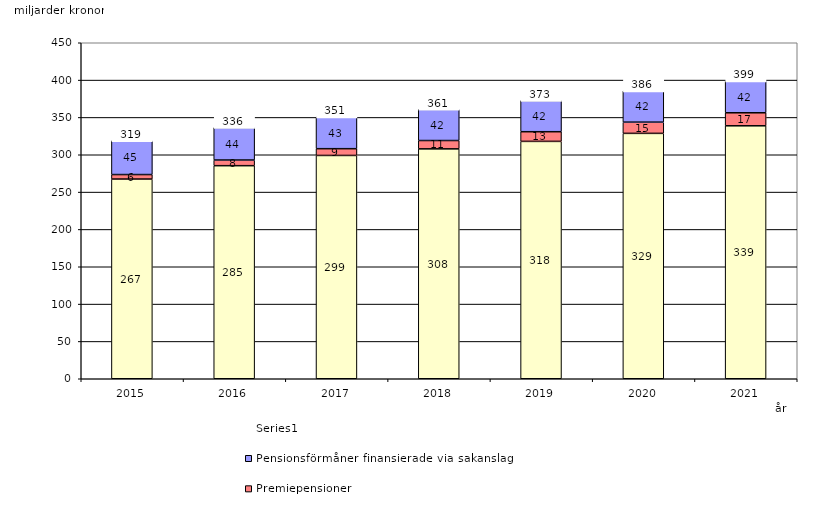
| Category | Inkomstpension och tilläggspension m.m. | Premiepensioner | Pensionsförmåner finansierade via sakanslag | Series 0 |
|---|---|---|---|---|
| 2015.0 | 267.466 | 6.008 | 45.361 | 20 |
| 2016.0 | 285.357 | 7.598 | 43.541 | 20 |
| 2017.0 | 299.062 | 9.073 | 42.518 | 20 |
| 2018.0 | 307.892 | 11.165 | 41.769 | 20 |
| 2019.0 | 317.908 | 12.954 | 41.759 | 20 |
| 2020.0 | 328.647 | 15.017 | 41.855 | 20 |
| 2021.0 | 338.797 | 17.427 | 42.442 | 20 |